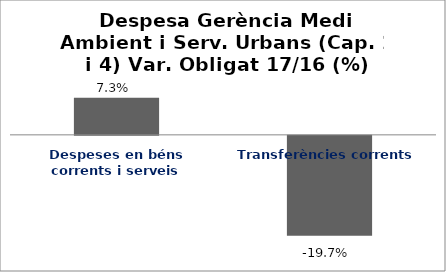
| Category | Series 0 |
|---|---|
| Despeses en béns corrents i serveis | 0.073 |
| Transferències corrents | -0.197 |